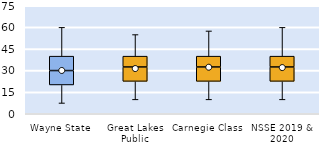
| Category | 25th | 50th | 75th |
|---|---|---|---|
| Wayne State | 20 | 10 | 10 |
| Great Lakes Public | 22.5 | 10 | 7.5 |
| Carnegie Class | 22.5 | 10 | 7.5 |
| NSSE 2019 & 2020 | 22.5 | 10 | 7.5 |